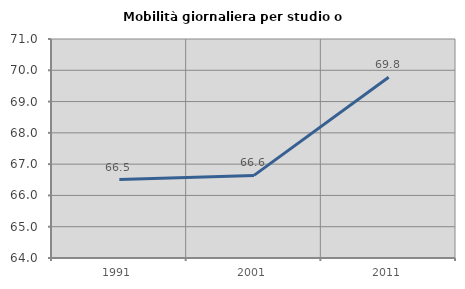
| Category | Mobilità giornaliera per studio o lavoro |
|---|---|
| 1991.0 | 66.508 |
| 2001.0 | 66.64 |
| 2011.0 | 69.775 |